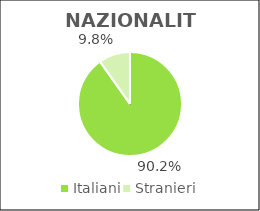
| Category | Series 0 |
|---|---|
| Italiani | 62676 |
| Stranieri | 6817 |